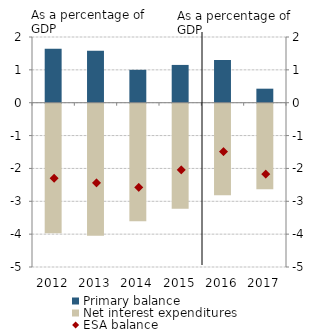
| Category | Primary balance |
|---|---|
| 2012.0 | 1.644 |
| 2013.0 | 1.58 |
| 2014.0 | 1.001 |
| 2015.0 | 1.15 |
| 2016.0 | 1.301 |
| 2017.0 | 0.427 |